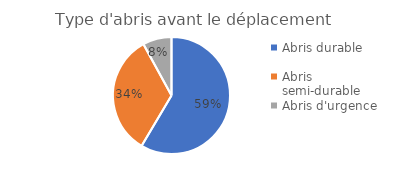
| Category | Pcentage |
|---|---|
| Abris durable | 0.585 |
| Abris semi-durable | 0.335 |
| Abris d'urgence | 0.08 |